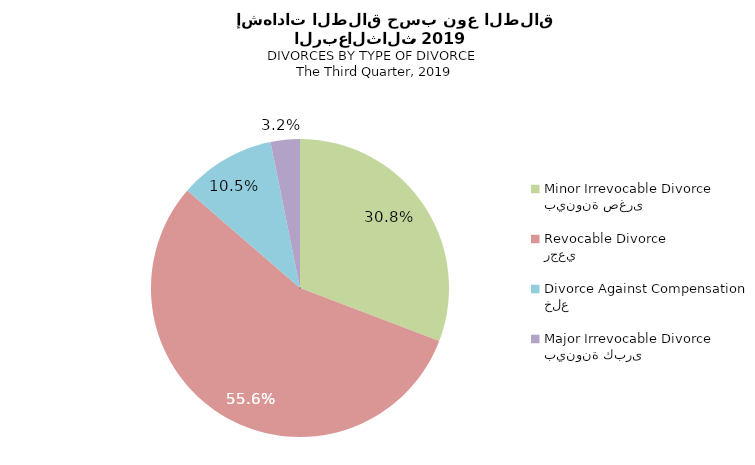
| Category | Series 1 |
|---|---|
| بينونة صغرى
Minor Irrevocable Divorce  | 30.794 |
| رجعي
Revocable Divorce  | 55.556 |
| خلع
Divorce Against Compensation | 10.476 |
| بينونة كبرى
Major Irrevocable Divorce  | 3.175 |